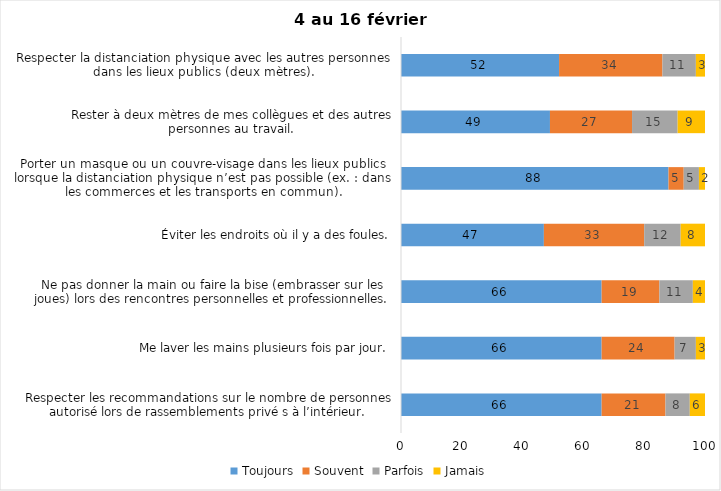
| Category | Toujours | Souvent | Parfois | Jamais |
|---|---|---|---|---|
| Respecter les recommandations sur le nombre de personnes autorisé lors de rassemblements privé s à l’intérieur. | 66 | 21 | 8 | 6 |
| Me laver les mains plusieurs fois par jour. | 66 | 24 | 7 | 3 |
| Ne pas donner la main ou faire la bise (embrasser sur les joues) lors des rencontres personnelles et professionnelles. | 66 | 19 | 11 | 4 |
| Éviter les endroits où il y a des foules. | 47 | 33 | 12 | 8 |
| Porter un masque ou un couvre-visage dans les lieux publics lorsque la distanciation physique n’est pas possible (ex. : dans les commerces et les transports en commun). | 88 | 5 | 5 | 2 |
| Rester à deux mètres de mes collègues et des autres personnes au travail. | 49 | 27 | 15 | 9 |
| Respecter la distanciation physique avec les autres personnes dans les lieux publics (deux mètres). | 52 | 34 | 11 | 3 |